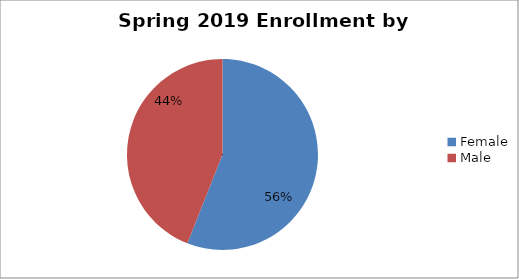
| Category | Series 0 |
|---|---|
| Female | 921 |
| Male | 724 |